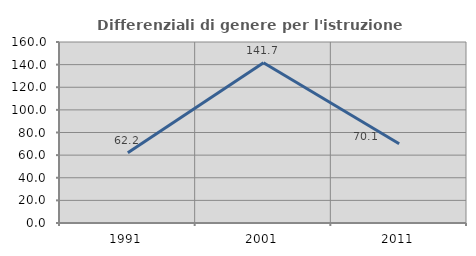
| Category | Differenziali di genere per l'istruzione superiore |
|---|---|
| 1991.0 | 62.174 |
| 2001.0 | 141.725 |
| 2011.0 | 70.076 |